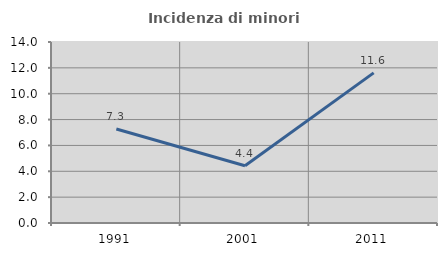
| Category | Incidenza di minori stranieri |
|---|---|
| 1991.0 | 7.273 |
| 2001.0 | 4.428 |
| 2011.0 | 11.613 |